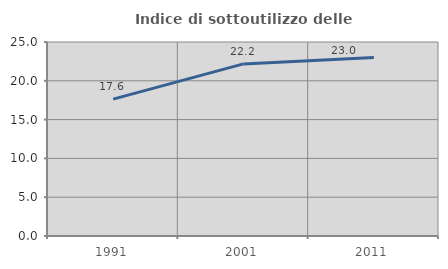
| Category | Indice di sottoutilizzo delle abitazioni  |
|---|---|
| 1991.0 | 17.642 |
| 2001.0 | 22.175 |
| 2011.0 | 23.015 |